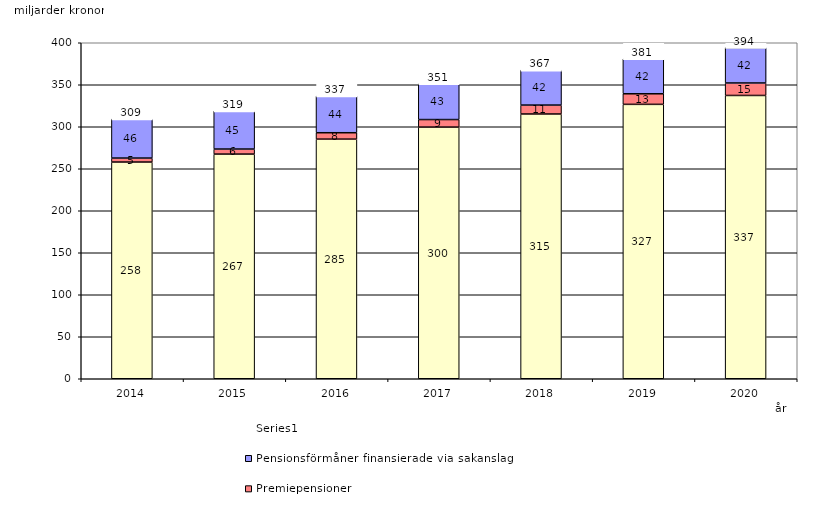
| Category | Inkomstpension och tilläggspension m.m. | Premiepensioner | Pensionsförmåner finansierade via sakanslag | Series 0 |
|---|---|---|---|---|
| 2014.0 | 257.988 | 4.739 | 46.4 | 20 |
| 2015.0 | 267.466 | 6.008 | 45.361 | 20 |
| 2016.0 | 285.267 | 7.617 | 43.66 | 20 |
| 2017.0 | 299.596 | 8.975 | 42.538 | 20 |
| 2018.0 | 315.183 | 10.633 | 41.578 | 20 |
| 2019.0 | 326.668 | 12.59 | 41.568 | 20 |
| 2020.0 | 337.254 | 14.86 | 42.111 | 20 |